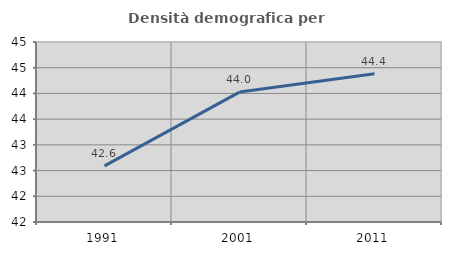
| Category | Densità demografica |
|---|---|
| 1991.0 | 42.592 |
| 2001.0 | 44.026 |
| 2011.0 | 44.384 |